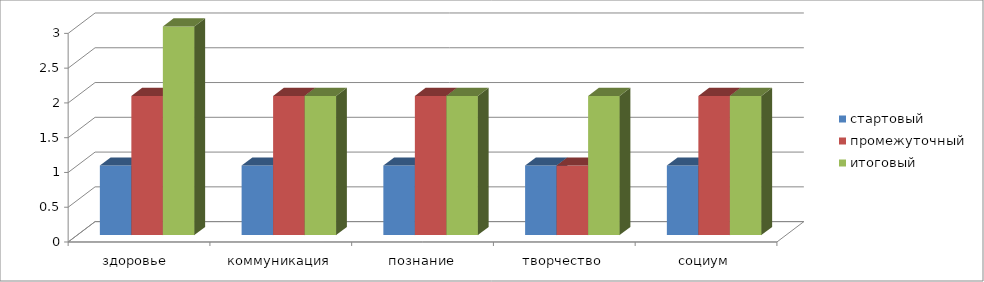
| Category | стартовый | промежуточный | итоговый |
|---|---|---|---|
| здоровье  | 1 | 2 | 3 |
| коммуникация | 1 | 2 | 2 |
| познание | 1 | 2 | 2 |
| творчество | 1 | 1 | 2 |
| социум | 1 | 2 | 2 |